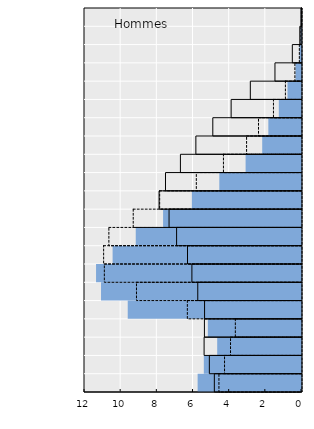
| Category | Ressortissants de pays tiers | Ressortissants de l’UEs | Nationaux |
|---|---|---|---|
| Less than 5 ans | 5.717 | 4.566 | 4.82 |
| From 5 to 9 ans | 5.374 | 4.256 | 5.095 |
| From 10 to 14 ans | 4.634 | 3.925 | 5.386 |
| From 15 to 19 ans | 5.151 | 3.659 | 5.369 |
| From 20 to 24 ans | 9.581 | 6.312 | 5.36 |
| From 25 to 29 ans | 11.058 | 9.125 | 5.736 |
| From 30 to 34 ans | 11.334 | 10.903 | 6.061 |
| From 35 to 39 ans | 10.419 | 10.942 | 6.303 |
| From 40 to 44 ans | 9.139 | 10.653 | 6.907 |
| From 45 to 49 ans | 7.627 | 9.306 | 7.324 |
| From 50 to 54 ans | 6.035 | 7.844 | 7.876 |
| From 55 to 59 ans | 4.517 | 5.816 | 7.521 |
| From 60 to 64 ans | 3.064 | 4.317 | 6.696 |
| From 65 to 69 ans | 2.145 | 3.037 | 5.841 |
| From 70 to 74 ans | 1.806 | 2.377 | 4.905 |
| From 75 to 79 ans | 1.227 | 1.551 | 3.891 |
| From 80 to 84 ans | 0.747 | 0.89 | 2.83 |
| From 85 to 89 ans | 0.305 | 0.366 | 1.468 |
| From 90 to 94 ans | 0.092 | 0.12 | 0.507 |
| From 95 to 99 ans | 0.025 | 0.031 | 0.093 |
| 100 ans or over | 0.005 | 0.005 | 0.01 |